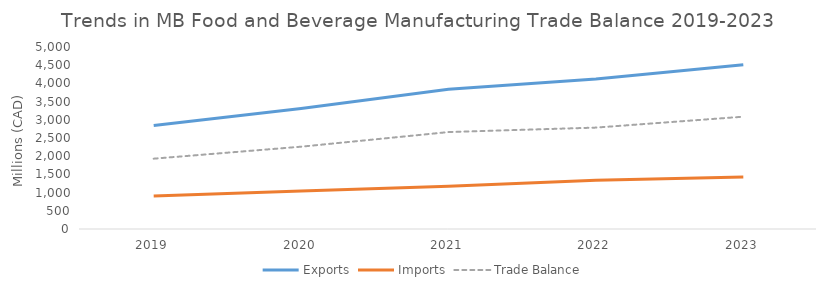
| Category | Exports | Imports | Trade Balance |
|---|---|---|---|
| 2019.0 | 2840.936 | 908.854 | 1932.082 |
| 2020.0 | 3307.446 | 1045.951 | 2261.495 |
| 2021.0 | 3837.377 | 1174.634 | 2662.743 |
| 2022.0 | 4123.942 | 1338.157 | 2785.786 |
| 2023.0 | 4512.716 | 1427.433 | 3085.283 |